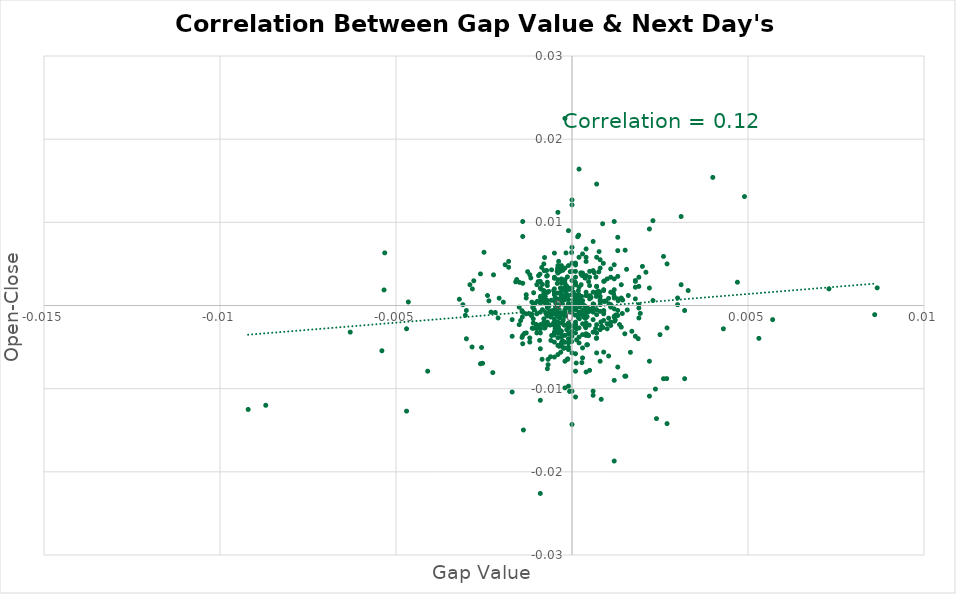
| Category | Series 0 |
|---|---|
| -0.00048999999999999 | -0.002 |
| -0.000419999999999975 | 0.004 |
| -0.000200000000000089 | -0.004 |
| -0.00102000000000002 | -0.002 |
| -0.000120000000000009 | -0.006 |
| -0.000340000000000007 | 0.004 |
| 0.000680000000000013 | 0.003 |
| -0.000850000000000017 | -0.006 |
| -0.000170000000000003 | 0 |
| 0.000249999999999972 | 0.004 |
| -0.000479999999999924 | 0.001 |
| 0.000210000000000043 | -0.001 |
| 0.00046999999999997 | -0.001 |
| 0.00121000000000004 | -0.002 |
| -0.000789999999999957 | 0.004 |
| 0.000330000000000052 | -0.001 |
| 4.000000000004e-05 | 0.002 |
| -0.00104999999999999 | 0 |
| 0.000269999999999992 | 0.001 |
| 0.000379999999999935 | -0.002 |
| 0.000529999999999919 | 0 |
| -0.000889999999999946 | 0.001 |
| -0.000340000000000007 | -0.001 |
| -0.000260000000000038 | 0.004 |
| 0.000259999999999927 | 0.002 |
| 0.000770000000000048 | 0.006 |
| 0.000110000000000054 | 0 |
| 0.00151000000000001 | 0.007 |
| -0.000659999999999993 | 0.002 |
| -0.00224999999999997 | -0.008 |
| -0.000130000000000074 | -0.006 |
| -0.000659999999999993 | 0 |
| -0.000520000000000076 | 0.002 |
| 0.000180000000000069 | 0 |
| -0.000680000000000013 | -0.007 |
| 0.000390000000000001 | -0.003 |
| -0.000819999999999931 | 0 |
| 0.000439999999999995 | -0.005 |
| -0.00139999999999995 | 0.003 |
| -0.00236000000000002 | 0.001 |
| 0.00193999999999994 | -0.001 |
| -0.00109000000000003 | 0.002 |
| -0.00110999999999994 | 0 |
| -0.000260000000000038 | -0.004 |
| 8.99999999999234e-05 | -0.001 |
| 2.000000000002e-05 | 0 |
| -0.00138000000000004 | -0.015 |
| -0.000150000000000094 | -0.003 |
| 0.000460000000000016 | -0.004 |
| -0.000719999999999942 | 0.004 |
| 0.00117999999999995 | 0.001 |
| -0.00125999999999992 | 0.004 |
| -0.000950000000000006 | 0.004 |
| -0.00091999999999992 | -0.004 |
| -0.000269999999999992 | 0 |
| -0.000430000000000041 | -0.003 |
| 0.000539999999999984 | 0.001 |
| 0.000219999999999998 | 0 |
| -0.000149999999999983 | 0.002 |
| -3.99999999999289e-05 | -0.003 |
| -1.00000000000655e-05 | -0.004 |
| 0.000519999999999964 | 0.001 |
| 0.00104000000000004 | 0.001 |
| -0.000700000000000033 | -0.001 |
| 0.000920000000000031 | 0.003 |
| -0.00051000000000001 | -0.004 |
| -0.000910000000000077 | 0.004 |
| 0.000759999999999982 | 0.004 |
| -0.000319999999999987 | 0.004 |
| 8.99999999999234e-05 | 0 |
| 0.0 | 0 |
| 3.99999999999289e-05 | 0 |
| 0.00124000000000001 | -0.001 |
| 0.000129999999999963 | -0.004 |
| -0.000419999999999975 | -0.003 |
| 0.00044999999999995 | -0.001 |
| -9.00000000000345e-05 | -0.002 |
| 0.000820000000000042 | -0.002 |
| 0.00165999999999999 | -0.006 |
| -0.000659999999999993 | 0 |
| -0.00465000000000004 | 0 |
| -0.00531999999999999 | 0.006 |
| -0.00222999999999995 | 0.004 |
| 0.00131000000000003 | 0.001 |
| -0.000820000000000042 | 0 |
| -0.000480000000000036 | 0 |
| 0.000369999999999981 | -0.002 |
| -0.00114000000000003 | 0 |
| -0.00053000000000003 | -0.001 |
| -0.000760000000000093 | 0.001 |
| -0.00148999999999999 | 0.003 |
| -0.000350000000000072 | 0.005 |
| -0.00110999999999994 | 0 |
| -0.000990000000000046 | 0 |
| 0.00046999999999997 | 0.003 |
| 0.000190000000000023 | 0.008 |
| 0.000689999999999968 | 0.001 |
| -0.000750000000000028 | -0.001 |
| -0.000929999999999986 | 0.003 |
| 8.000000000008e-05 | -0.003 |
| -8.99999999999234e-05 | 0 |
| 0.00042999999999993 | -0.001 |
| 0.00040999999999991 | 0 |
| -0.000470000000000081 | 0 |
| 0.000120000000000009 | -0.007 |
| 0.000750000000000028 | 0.002 |
| -0.00256999999999996 | -0.005 |
| -0.000360000000000027 | -0.005 |
| -4.99999999999944e-05 | -0.001 |
| -0.00253999999999998 | -0.007 |
| -0.000580000000000024 | -0.004 |
| 0.000290000000000012 | 0.004 |
| 0.000870000000000037 | 0.01 |
| -0.000170000000000003 | 0.002 |
| 0.00095999999999996 | 0.001 |
| 0.0 | 0 |
| -0.000380000000000047 | -0.003 |
| 0.00268999999999997 | -0.009 |
| -4.99999999999944e-05 | 0.004 |
| -0.000310000000000032 | -0.001 |
| 0.00156999999999996 | -0.001 |
| 0.00016000000000016 | 0.008 |
| -0.000459999999999904 | -0.003 |
| -0.000780000000000002 | 0.002 |
| -0.00085999999999986 | 0.005 |
| -0.000900000000000122 | -0.002 |
| -0.00059000000000009 | -0.001 |
| -0.000919999999999809 | -0.003 |
| -0.000520000000000076 | -0.002 |
| -0.000779999999999891 | 0 |
| -0.000500000000000056 | -0.004 |
| 0.000789999999999957 | 0.002 |
| 9.00000000001455e-05 | 0.001 |
| -0.000479999999999813 | -0.003 |
| -0.00141000000000002 | -0.001 |
| -0.00115000000000009 | -0.001 |
| -0.000489999999999879 | 0 |
| -0.000280000000000058 | -0.004 |
| -0.00141999999999997 | -0.004 |
| -0.00059000000000009 | 0.001 |
| -0.00112999999999996 | -0.003 |
| 0.000369999999999981 | 0.003 |
| -0.000170000000000003 | 0.006 |
| -0.000709999999999988 | 0 |
| -1.00000000000655e-05 | 0.006 |
| -0.00282999999999999 | 0.002 |
| 0.000370000000000092 | 0 |
| -0.000279999999999947 | 0.001 |
| -0.00053000000000003 | -0.002 |
| -0.000380000000000047 | 0.005 |
| -0.000609999999999999 | -0.006 |
| -0.000250000000000083 | -0.002 |
| -0.000219999999999998 | -0.005 |
| -0.00114000000000003 | -0.001 |
| -0.00159999999999993 | 0.003 |
| 9.99999999995449e-06 | 0 |
| -0.00134999999999996 | -0.003 |
| 0.00103999999999993 | -0.006 |
| 9.99999999999889e-05 | 0.005 |
| -0.000680000000000013 | -0.006 |
| 0.000619999999999953 | 0 |
| -0.00095999999999996 | 0.003 |
| -0.000720000000000053 | 0.004 |
| -0.000709999999999988 | 0.002 |
| -0.000450000000000061 | -0.002 |
| -0.000780000000000002 | 0.006 |
| -0.000730000000000008 | -0.001 |
| -0.000410000000000021 | 0.004 |
| -0.000709999999999988 | -0.002 |
| 0.000669999999999948 | -0.003 |
| 3.99999999999289e-05 | 0.001 |
| -0.00195 | 0 |
| -0.00146000000000001 | -0.002 |
| 0.000360000000000027 | 0 |
| 0.00135000000000007 | -0.002 |
| -0.000840000000000062 | -0.001 |
| -0.000649999999999928 | -0.001 |
| 0.000129999999999963 | -0.003 |
| -0.000320000000000098 | -0.003 |
| -0.000399999999999955 | -0.004 |
| -7.99999999999689e-05 | 0.002 |
| -0.000879999999999991 | 0.002 |
| -0.000780000000000002 | -0.003 |
| -0.000500000000000056 | 0.001 |
| 0.000500000000000056 | 0.001 |
| -0.000130000000000074 | 0.003 |
| -0.00283999999999995 | -0.005 |
| -0.000229999999999952 | -0.002 |
| 0.000209999999999932 | -0.002 |
| 7.99999999999689e-05 | 0 |
| 0.00143999999999999 | 0.001 |
| 0.00046999999999997 | -0.004 |
| -0.00302999999999997 | -0.001 |
| 0.000890000000000057 | 0.005 |
| 0.000490000000000101 | -0.002 |
| -0.00156999999999996 | 0.003 |
| 0.000700000000000033 | 0.001 |
| 0.00530999999999992 | -0.004 |
| -0.000369999999999981 | -0.003 |
| -0.000240000000000018 | -0.005 |
| -0.000609999999999999 | -0.001 |
| -0.0020699999999999 | 0.001 |
| 9.00000000000345e-05 | 0.003 |
| 0.000419999999999975 | 0 |
| -0.000360000000000027 | -0.002 |
| -0.000210000000000043 | -0.002 |
| 0.000279999999999947 | -0.007 |
| 0.00154999999999994 | 0.004 |
| 0.00143000000000004 | -0.001 |
| 0.00236999999999998 | -0.01 |
| -0.00534000000000001 | 0.002 |
| -0.00218000000000007 | -0.001 |
| -0.000419999999999975 | 0.003 |
| -7.00000000000145e-05 | -0.01 |
| -0.000639999999999973 | -0.001 |
| 0.000179999999999958 | 0.002 |
| -0.000600000000000044 | -0.001 |
| -0.000310000000000032 | 0.001 |
| -0.000619999999999953 | -0.002 |
| -0.000319999999999987 | -0.006 |
| -0.000280000000000058 | -0.004 |
| -0.000759999999999982 | -0.003 |
| -0.00107000000000001 | -0.001 |
| 0.00122999999999995 | -0.002 |
| 0.000840000000000062 | -0.002 |
| 0.00104999999999999 | 0 |
| -0.00117 | 0.003 |
| 0.000829999999999997 | -0.011 |
| -0.00109999999999999 | -0.003 |
| -0.00539999999999996 | -0.005 |
| -0.00141999999999997 | -0.001 |
| 0.000110000000000054 | 0 |
| -0.000720000000000053 | 0.001 |
| -0.00279000000000007 | 0.003 |
| -0.000419999999999975 | -0.001 |
| -0.000839999999999951 | 0.003 |
| 0.000689999999999857 | -0.004 |
| -0.000490000000000101 | -0.002 |
| -1.99999999999089e-05 | 0 |
| 0.000879999999999991 | -0.003 |
| -0.000299999999999967 | 0.001 |
| -0.00319999999999998 | 0.001 |
| -0.000580000000000024 | 0.004 |
| 0.00103999999999993 | -0.002 |
| -0.000330000000000163 | 0.002 |
| 0.00187999999999988 | -0.004 |
| -0.000669999999999948 | -0.001 |
| -0.000410000000000021 | -0.001 |
| 0.00063000000000013 | 0.004 |
| 0.000259999999999927 | 0.004 |
| -0.00139 | -0.001 |
| 0.000110000000000054 | 0.001 |
| 0.00152999999999992 | -0.009 |
| 0.00866999999999995 | 0.002 |
| 0.000179999999999958 | -0.001 |
| 0.000929999999999986 | 0.001 |
| -0.000399999999999955 | 0.001 |
| 0.000419999999999975 | -0.005 |
| 0.0 | -0.002 |
| -0.000299999999999967 | 0.001 |
| 0.000199999999999978 | 0 |
| -0.000299999999999967 | 0.003 |
| 0.000199999999999978 | 0 |
| 0.000299999999999967 | 0 |
| 0.00130000000000007 | -0.001 |
| -0.000500000000000056 | 0.001 |
| -0.001 | -0.003 |
| -9.99999999999889e-05 | 0.001 |
| 0.000900000000000011 | 0.002 |
| -0.000199999999999978 | -0.001 |
| -0.00129999999999996 | -0.001 |
| 0.00109999999999999 | 0.003 |
| 0.00250000000000005 | -0.003 |
| 0.00190000000000001 | 0 |
| -0.000399999999999955 | 0 |
| 0.00129999999999996 | 0.007 |
| -0.000500000000000056 | 0.002 |
| 0.000700000000000033 | 0.002 |
| -0.000500000000000056 | -0.002 |
| -0.000200000000000089 | 0.001 |
| -0.00120000000000009 | 0.004 |
| 0.000599999999999933 | 0.004 |
| -0.00239999999999995 | 0.001 |
| -0.000600000000000044 | -0.001 |
| 0.000600000000000044 | 0 |
| -0.000699999999999922 | 0.003 |
| 0.000200000000000089 | -0.001 |
| 0.000199999999999978 | -0.004 |
| 9.99999999999889e-05 | -0.002 |
| 0.00119999999999997 | 0 |
| -0.000200000000000089 | -0.01 |
| 0.00119999999999997 | -0.009 |
| 0.00119999999999997 | 0.005 |
| -0.000999999999999889 | 0.002 |
| -0.000399999999999955 | 0.003 |
| -0.000600000000000156 | -0.004 |
| 0.000299999999999967 | -0.006 |
| 0.00859999999999994 | -0.001 |
| -0.000199999999999978 | -0.001 |
| 0.00119999999999997 | 0.001 |
| 0.000900000000000011 | -0.002 |
| 0.00109999999999999 | -0.002 |
| 0.000399999999999955 | 0.001 |
| 0.0011000000000001 | 0.002 |
| 0.000799999999999911 | -0.003 |
| -0.000700000000000145 | 0.002 |
| -0.00209999999999999 | -0.001 |
| 0.000699999999999922 | -0.003 |
| -0.000900000000000011 | -0.003 |
| -0.000399999999999955 | -0.001 |
| -9.99999999999889e-05 | -0.004 |
| -0.000399999999999955 | 0.005 |
| 0.00109999999999999 | -0.002 |
| 0.000199999999999978 | 0.001 |
| -0.001 | -0.003 |
| -0.000399999999999955 | -0.005 |
| 0.000199999999999978 | 0.016 |
| 0.000299999999999967 | -0.002 |
| -0.00170000000000003 | -0.002 |
| 0.00140000000000006 | -0.003 |
| 9.99999999999889e-05 | 0 |
| -0.000299999999999967 | -0.003 |
| 0.00260000000000004 | -0.009 |
| 0.003 | 0.001 |
| 0.0048999999999999 | 0.013 |
| -0.00120000000000009 | -0.004 |
| 0.00180000000000002 | 0.001 |
| 0.0 | 0.012 |
| 0.0 | -0.006 |
| 0.000600000000000044 | -0.002 |
| 0.0 | -0.01 |
| 0.000399999999999955 | -0.002 |
| 0.00140000000000006 | 0.001 |
| 0.00109999999999999 | 0 |
| -0.000900000000000011 | -0.005 |
| 0.00190000000000001 | 0.003 |
| -0.000199999999999978 | -0.007 |
| 0.000299999999999967 | -0.005 |
| -0.00139999999999995 | 0.008 |
| -0.000500000000000167 | -0.003 |
| 0.000499999999999944 | 0.001 |
| -0.000299999999999967 | -0.005 |
| 0.00319999999999998 | -0.009 |
| -0.000700000000000033 | 0 |
| -0.000300000000000078 | 0.003 |
| 0.00429999999999997 | -0.003 |
| -0.000900000000000011 | -0.023 |
| 0.00120000000000009 | -0.019 |
| -0.000799999999999911 | -0.002 |
| 0.00729999999999986 | 0.002 |
| -0.000400000000000067 | -0.002 |
| -9.99999999999889e-05 | 0 |
| -0.000700000000000033 | -0.002 |
| 9.99999999999889e-05 | 0.003 |
| 0.000900000000000011 | 0.002 |
| 0.00260000000000004 | 0.006 |
| -0.000499999999999944 | -0.006 |
| -0.00129999999999996 | -0.003 |
| 0.00190000000000001 | -0.001 |
| -9.99999999999889e-05 | 0.002 |
| 0.000499999999999944 | 0.004 |
| -9.99999999999889e-05 | 0.009 |
| 0.00120000000000009 | 0.01 |
| 0.000299999999999967 | 0.001 |
| -0.000199999999999978 | 0.001 |
| -0.000900000000000011 | -0.003 |
| -9.99999999999889e-05 | -0.005 |
| 0.000700000000000033 | 0 |
| 0.00330000000000008 | 0.002 |
| 0.000399999999999955 | -0.004 |
| 0.000399999999999955 | -0.001 |
| 0.000199999999999978 | -0.001 |
| -9.99999999999889e-05 | 0.001 |
| -0.000700000000000033 | 0 |
| -9.99999999999889e-05 | 0 |
| 9.99999999999889e-05 | 0.001 |
| 0.0001000000000001 | 0.004 |
| 0.000199999999999978 | 0.001 |
| -0.000199999999999978 | 0.003 |
| -0.000299999999999967 | -0.004 |
| -9.99999999999889e-05 | -0.003 |
| 0.000200000000000089 | 0.001 |
| -0.000399999999999955 | 0 |
| 0.000299999999999967 | -0.001 |
| -0.000400000000000067 | 0 |
| -0.000699999999999922 | 0.001 |
| -0.000399999999999955 | -0.002 |
| 0.001 | -0.003 |
| 0.0 | 0.004 |
| 9.99999999999889e-05 | 0.003 |
| -0.000400000000000067 | 0.001 |
| 0.000500000000000056 | -0.001 |
| 0.0 | 0 |
| -0.00140000000000006 | -0.005 |
| -0.000500000000000056 | -0.002 |
| -0.000900000000000011 | 0 |
| 0.000399999999999955 | 0.002 |
| 0.000399999999999955 | 0.006 |
| 9.99999999999889e-05 | -0.002 |
| 0.000799999999999911 | 0.001 |
| -0.000499999999999944 | 0.003 |
| -0.000900000000000011 | 0 |
| -0.000900000000000011 | 0.003 |
| -0.000199999999999978 | 0.002 |
| 0.000199999999999978 | 0.002 |
| -0.000300000000000078 | 0.001 |
| -9.99999999999889e-05 | -0.003 |
| -9.99999999999889e-05 | -0.005 |
| 0.0 | 0.002 |
| 0.000900000000000011 | 0.003 |
| 9.99999999999889e-05 | 0.003 |
| -0.000500000000000056 | -0.003 |
| -9.99999999999889e-05 | 0 |
| -0.00229999999999996 | -0.001 |
| -0.000400000000000067 | 0.004 |
| 0.000600000000000044 | 0.002 |
| -0.000500000000000056 | -0.001 |
| -0.00470000000000003 | -0.003 |
| 0.000700000000000033 | 0.006 |
| 0.00170000000000003 | -0.003 |
| -0.000800000000000022 | -0.002 |
| -0.000299999999999967 | 0.002 |
| 9.99999999999889e-05 | -0.003 |
| -0.000300000000000078 | 0.002 |
| 9.99999999999889e-05 | -0.002 |
| 0.000400000000000067 | 0.005 |
| -0.000300000000000078 | -0.002 |
| 0.00190000000000001 | 0.002 |
| 9.99999999999889e-05 | 0 |
| 0.00180000000000002 | 0.003 |
| 0.0008999999999999 | -0.001 |
| 0.001 | 0.003 |
| 0.00230000000000008 | 0.01 |
| 0.000399999999999955 | -0.001 |
| -0.00290000000000001 | 0.003 |
| 0.00130000000000007 | 0.001 |
| 0.0 | -0.003 |
| -0.00180000000000002 | 0.005 |
| -0.00109999999999999 | -0.002 |
| 0.000199999999999978 | -0.004 |
| -0.000600000000000044 | -0.001 |
| 0.000499999999999944 | 0.003 |
| 0.000499999999999944 | -0.008 |
| 0.00570000000000003 | -0.002 |
| 0.000800000000000022 | 0.006 |
| -0.000799999999999911 | 0.002 |
| 0.00119999999999997 | -0.001 |
| 0.000900000000000011 | -0.001 |
| 0.000199999999999978 | -0.003 |
| 0.000800000000000022 | 0 |
| 0.00119999999999997 | 0.001 |
| 0.000700000000000033 | 0.002 |
| 0.000399999999999955 | -0.008 |
| -0.000199999999999978 | 0.003 |
| -9.99999999999889e-05 | -0.002 |
| 0.00109999999999999 | 0 |
| -0.000900000000000011 | -0.001 |
| 0.00180000000000002 | 0.003 |
| -0.000800000000000022 | 0.002 |
| 9.99999999999889e-05 | 0 |
| 0.000199999999999978 | 0.006 |
| -9.99999999999889e-05 | 0 |
| 0.001 | -0.002 |
| 0.000700000000000033 | -0.001 |
| 0.0 | 0.001 |
| -0.000400000000000067 | 0 |
| 0.000599999999999933 | -0.003 |
| 0.000700000000000033 | 0.002 |
| -9.99999999999889e-05 | -0.003 |
| -0.000399999999999955 | -0.001 |
| -9.99999999999889e-05 | -0.002 |
| -0.000199999999999978 | 0.001 |
| 0.000399999999999955 | -0.001 |
| -0.000299999999999967 | 0.001 |
| 9.99999999999889e-05 | 0.003 |
| -0.000900000000000011 | 0 |
| 0.00149999999999994 | -0.003 |
| 0.003 | 0 |
| -0.00149999999999994 | 0 |
| 0.00209999999999999 | 0.004 |
| -0.000699999999999922 | -0.008 |
| 0.00180000000000002 | -0.004 |
| -0.00409999999999999 | -0.008 |
| -0.00920000000000009 | -0.013 |
| 0.00129999999999996 | 0.008 |
| -0.003 | -0.004 |
| 0.00119999999999997 | 0.003 |
| 0.000900000000000011 | -0.006 |
| 0.00469999999999992 | 0.003 |
| 0.00109999999999999 | 0 |
| 0.00270000000000003 | -0.003 |
| 0.000800000000000022 | 0.005 |
| -0.000199999999999978 | -0.001 |
| -0.00109999999999999 | -0.002 |
| -0.000200000000000089 | 0.004 |
| 0.000299999999999967 | 0.004 |
| 0.00109999999999999 | 0.004 |
| 0.000500000000000056 | 0.002 |
| -0.00120000000000009 | -0.004 |
| -0.00260000000000004 | 0.004 |
| -0.00170000000000003 | -0.004 |
| 0.00230000000000008 | 0.001 |
| -0.000400000000000067 | -0.006 |
| 0.00309999999999999 | 0.011 |
| 0.00319999999999998 | -0.001 |
| 0.00220000000000009 | 0.009 |
| -0.000199999999999978 | -0.001 |
| 0.000800000000000022 | 0.001 |
| 0.000300000000000078 | -0.001 |
| 0.00240000000000006 | -0.014 |
| -0.000400000000000067 | -0.001 |
| -0.00190000000000001 | 0.005 |
| 0.000800000000000022 | -0.001 |
| -0.00170000000000003 | -0.01 |
| 0.00270000000000003 | -0.014 |
| 0.0 | -0.014 |
| 0.00270000000000003 | 0.005 |
| 0.000800000000000022 | -0.007 |
| -0.000199999999999978 | 0.023 |
| 0.00220000000000009 | -0.011 |
| -0.000199999999999978 | 0.002 |
| 0.00150000000000005 | -0.008 |
| 0.00120000000000009 | 0.002 |
| 0.0 | 0.003 |
| 0.000599999999999933 | -0.01 |
| 0.000700000000000033 | -0.004 |
| 9.99999999999889e-05 | -0.006 |
| 0.0 | 0.013 |
| 0.000399999999999955 | 0.001 |
| 0.000700000000000033 | 0.015 |
| 0.000900000000000011 | -0.001 |
| 0.00160000000000004 | 0.001 |
| 0.000599999999999933 | 0 |
| -0.000700000000000033 | -0.002 |
| 0.002 | 0.005 |
| 0.000299999999999967 | 0.006 |
| 0.000600000000000044 | -0.001 |
| -0.003 | -0.001 |
| 0.000600000000000044 | -0.011 |
| 0.000600000000000044 | 0.008 |
| 0.000399999999999955 | 0.007 |
| 0.000199999999999978 | -0.001 |
| -0.000400000000000067 | 0.004 |
| 0.000399999999999955 | -0.003 |
| 0.000800000000000022 | 0.001 |
| 0.0 | -0.001 |
| 0.000400000000000067 | 0.004 |
| -9.99999999999889e-05 | -0.005 |
| -9.99999999999889e-05 | 0.005 |
| 0.00119999999999997 | -0.001 |
| -0.000300000000000078 | -0.001 |
| -0.001 | -0.003 |
| 0.00130000000000007 | 0.004 |
| 0.00309999999999999 | 0.003 |
| -0.000900000000000011 | -0.002 |
| -0.00249999999999994 | 0.006 |
| -0.0008999999999999 | -0.002 |
| 0.00140000000000006 | 0.003 |
| 0.000900000000000011 | 0 |
| -0.000900000000000011 | 0.002 |
| -0.000300000000000078 | 0.003 |
| 0.004 | 0.015 |
| 0.00129999999999996 | -0.007 |
| -0.000799999999999911 | 0.001 |
| -0.000699999999999922 | 0.004 |
| -0.00260000000000004 | -0.007 |
| 0.00219999999999998 | -0.007 |
| -9.99999999999889e-05 | -0.01 |
| -0.00309999999999999 | 0 |
| -0.00149999999999994 | -0.002 |
| -0.000399999999999955 | -0.003 |
| -0.000900000000000011 | 0.001 |
| -0.00140000000000006 | -0.004 |
| -0.000299999999999967 | 0.005 |
| -0.000399999999999955 | 0.011 |
| 0.0 | 0.007 |
| -0.00130000000000007 | 0.001 |
| 9.99999999999889e-05 | -0.008 |
| -0.00140000000000006 | 0.01 |
| -0.0008999999999999 | -0.011 |
| -0.00130000000000007 | 0.001 |
| 0.0 | 0.005 |
| 0.0 | -0.004 |
| -0.0002000000000002 | -0.004 |
| 0.000299999999999967 | -0.004 |
| 9.99999999999889e-05 | 0.005 |
| -0.000800000000000133 | -0.002 |
| -0.000499999999999944 | 0.006 |
| 0.000600000000000156 | 0 |
| -0.000699999999999922 | 0.002 |
| 9.99999999999889e-05 | -0.011 |
| 0.000199999999999978 | 0.001 |
| -0.00870000000000015 | -0.012 |
| -0.00469999999999992 | -0.013 |
| 0.00180000000000002 | 0.002 |
| 0.00190000000000001 | 0 |
| -0.000800000000000133 | 0.005 |
| 0.000699999999999922 | -0.002 |
| -0.00629999999999997 | -0.003 |
| -0.000499999999999944 | 0.003 |
| -0.000300000000000189 | -0.005 |
| -0.00100000000000011 | -0.001 |
| 0.000700000000000145 | -0.006 |
| -0.00119999999999986 | -0.001 |
| 0.00130000000000007 | -0.001 |
| 0.00219999999999998 | 0.002 |
| -0.000499999999999944 | 0.003 |
| -0.00109999999999987 | 0 |
| 0.0 | 0.001 |
| -0.00180000000000002 | 0.005 |